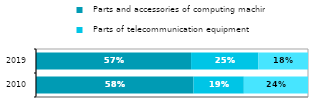
| Category |   Parts and accessories of computing machines |   Parts of telecommunication equipment |   Parts of consumer electronics |
|---|---|---|---|
| 2010 | 0.579 | 0.185 | 0.236 |
| 2019 | 0.57 | 0.248 | 0.182 |